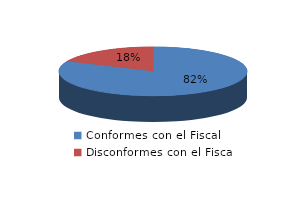
| Category | Series 0 |
|---|---|
| 0 | 54 |
| 1 | 12 |